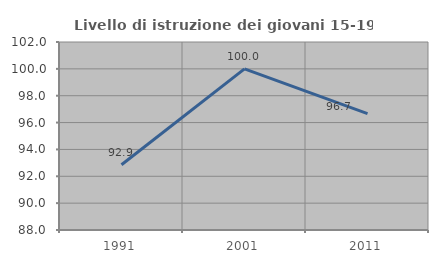
| Category | Livello di istruzione dei giovani 15-19 anni |
|---|---|
| 1991.0 | 92.857 |
| 2001.0 | 100 |
| 2011.0 | 96.667 |